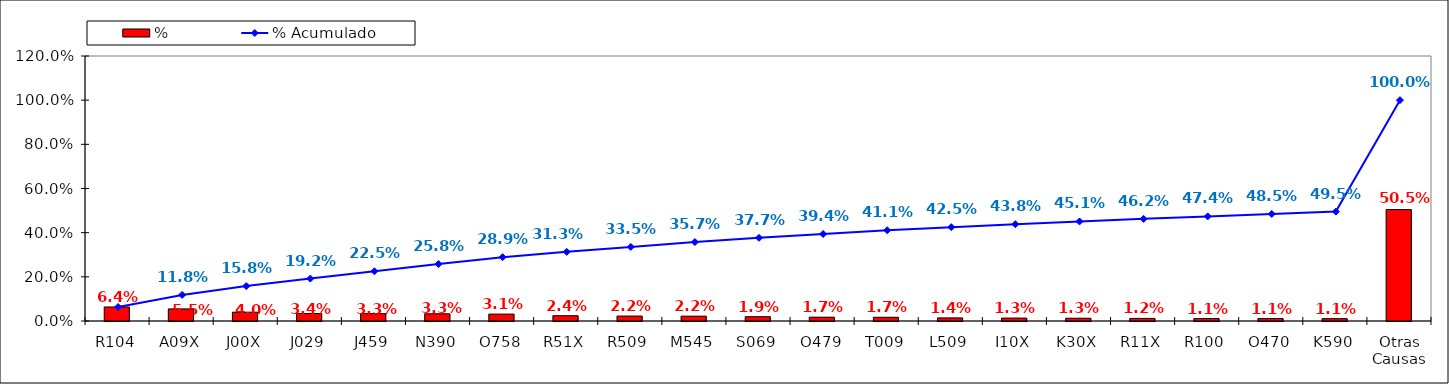
| Category | % |
|---|---|
| R104 | 0.064 |
| A09X | 0.055 |
| J00X | 0.04 |
| J029 | 0.034 |
| J459 | 0.033 |
| N390 | 0.033 |
| O758 | 0.031 |
| R51X | 0.024 |
| R509 | 0.022 |
| M545 | 0.022 |
| S069 | 0.019 |
| O479 | 0.017 |
| T009 | 0.017 |
| L509 | 0.014 |
| I10X | 0.013 |
| K30X | 0.013 |
| R11X | 0.012 |
| R100 | 0.011 |
| O470 | 0.011 |
| K590 | 0.011 |
| Otras Causas | 0.505 |